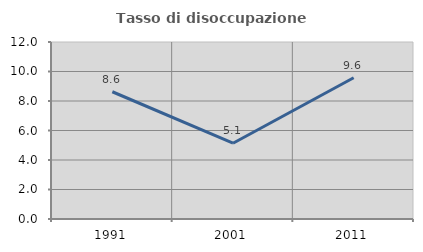
| Category | Tasso di disoccupazione giovanile  |
|---|---|
| 1991.0 | 8.627 |
| 2001.0 | 5.136 |
| 2011.0 | 9.577 |